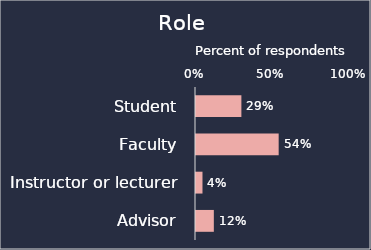
| Category | % of respondents |
|---|---|
| Student | 0.295 |
| Faculty | 0.537 |
| Instructor or lecturer | 0.042 |
| Advisor | 0.116 |